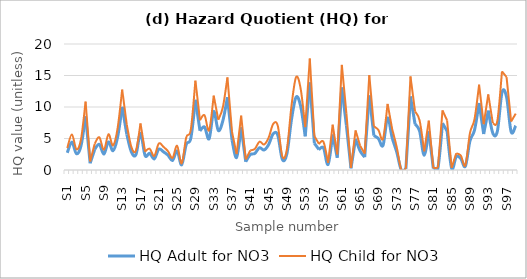
| Category | HQ Adult for NO3 | HQ Child for NO3 |
|---|---|---|
| S1 | 2.729 | 3.474 |
| S2 | 4.439 | 5.65 |
| S3 | 2.587 | 3.293 |
| S4 | 3.847 | 4.896 |
| S5 | 8.53 | 10.857 |
| S6 | 1.069 | 1.36 |
| S7 | 3.292 | 4.19 |
| S8 | 4.082 | 5.195 |
| S9 | 2.518 | 3.204 |
| S10 | 4.455 | 5.67 |
| S11 | 3.063 | 3.899 |
| S12 | 5.224 | 6.649 |
| S13 | 10.03 | 12.766 |
| S14 | 5.665 | 7.21 |
| S15 | 2.874 | 3.658 |
| S16 | 2.428 | 3.09 |
| S17 | 5.809 | 7.394 |
| S18 | 2.298 | 2.924 |
| S19 | 2.658 | 3.383 |
| S20 | 1.754 | 2.232 |
| S21 | 3.299 | 4.199 |
| S22 | 2.9 | 3.691 |
| S23 | 2.351 | 2.992 |
| S24 | 1.513 | 1.925 |
| S25 | 3.025 | 3.85 |
| S26 | 0.821 | 1.045 |
| S27 | 4.069 | 5.179 |
| S28 | 5.058 | 6.437 |
| S29 | 11.143 | 14.182 |
| S30 | 6.219 | 7.915 |
| S31 | 6.82 | 8.68 |
| S32 | 4.955 | 6.306 |
| S33 | 9.276 | 11.806 |
| S34 | 6.267 | 7.976 |
| S35 | 7.824 | 9.958 |
| S36 | 11.551 | 14.701 |
| S37 | 4.752 | 6.048 |
| S38 | 1.992 | 2.536 |
| S39 | 6.774 | 8.622 |
| S40 | 1.319 | 1.679 |
| S41 | 2.442 | 3.108 |
| S42 | 2.639 | 3.359 |
| S43 | 3.536 | 4.5 |
| S44 | 3.176 | 4.043 |
| S45 | 4.027 | 5.125 |
| S46 | 5.744 | 7.31 |
| S47 | 5.522 | 7.028 |
| S48 | 1.669 | 2.124 |
| S49 | 2.594 | 3.302 |
| S50 | 8.024 | 10.212 |
| S51 | 11.579 | 14.737 |
| S52 | 10.143 | 12.91 |
| S53 | 5.35 | 6.809 |
| S54 | 13.909 | 17.703 |
| S55 | 4.236 | 5.391 |
| S56 | 3.251 | 4.137 |
| S57 | 3.492 | 4.444 |
| S58 | 0.886 | 1.128 |
| S59 | 5.647 | 7.187 |
| S60 | 1.944 | 2.474 |
| S61 | 13.115 | 16.692 |
| S62 | 7.052 | 8.976 |
| S63 | 0.27 | 0.344 |
| S64 | 4.942 | 6.29 |
| S65 | 3.02 | 3.844 |
| S66 | 2.035 | 2.59 |
| S67 | 11.843 | 15.072 |
| S68 | 5.456 | 6.945 |
| S69 | 4.981 | 6.34 |
| S70 | 3.899 | 4.962 |
| S71 | 8.245 | 10.494 |
| S72 | 5.111 | 6.505 |
| S73 | 2.846 | 3.622 |
| S74 | 0 | 0 |
| S75 | 0.193 | 0.246 |
| S76 | 11.67 | 14.853 |
| S77 | 7.299 | 9.29 |
| S78 | 6.175 | 7.86 |
| S79 | 2.334 | 2.97 |
| S80 | 6.153 | 7.831 |
| S81 | 0.233 | 0.297 |
| S82 | 0.28 | 0.356 |
| S83 | 7.432 | 9.459 |
| S84 | 6.191 | 7.879 |
| S85 | 0.262 | 0.334 |
| S86 | 2.082 | 2.649 |
| S87 | 1.805 | 2.297 |
| S88 | 0.596 | 0.759 |
| S89 | 4.61 | 5.868 |
| S90 | 6.356 | 8.09 |
| S91 | 10.636 | 13.537 |
| S92 | 5.708 | 7.265 |
| S93 | 9.432 | 12.005 |
| S94 | 5.837 | 7.43 |
| S95 | 6.18 | 7.865 |
| S96 | 12.292 | 15.645 |
| S97 | 11.593 | 14.755 |
| S98 | 6.046 | 7.695 |
| S99 | 7.03 | 8.947 |